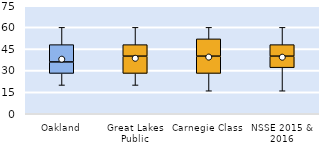
| Category | 25th | 50th | 75th |
|---|---|---|---|
| Oakland | 28 | 8 | 12 |
| Great Lakes Public | 28 | 12 | 8 |
| Carnegie Class | 28 | 12 | 12 |
| NSSE 2015 & 2016 | 32 | 8 | 8 |